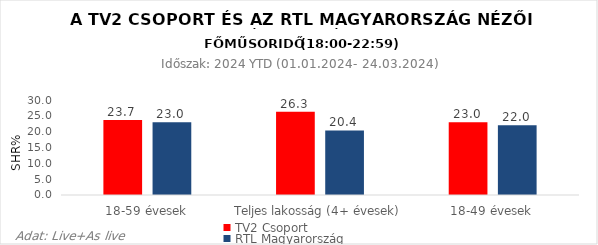
| Category | TV2 Csoport | RTL Magyarország |
|---|---|---|
| 18-59 évesek | 23.7 | 23 |
| Teljes lakosság (4+ évesek) | 26.3 | 20.4 |
| 18-49 évesek | 23 | 22 |